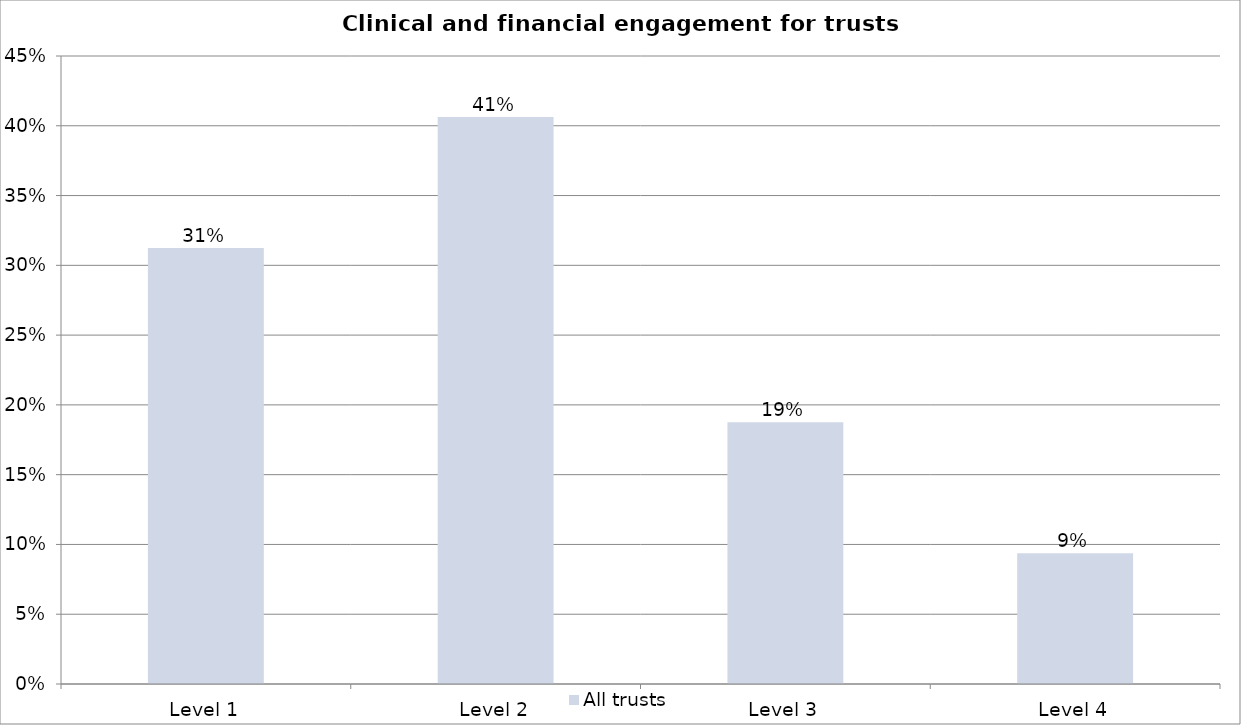
| Category | All trusts |
|---|---|
| Level 1 | 0.312 |
| Level 2 | 0.406 |
| Level 3 | 0.188 |
| Level 4 | 0.094 |